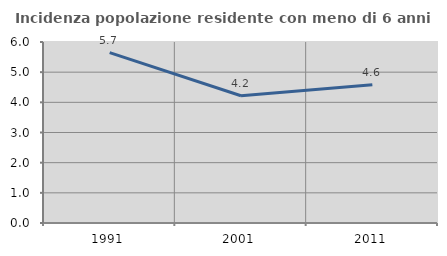
| Category | Incidenza popolazione residente con meno di 6 anni |
|---|---|
| 1991.0 | 5.65 |
| 2001.0 | 4.218 |
| 2011.0 | 4.586 |